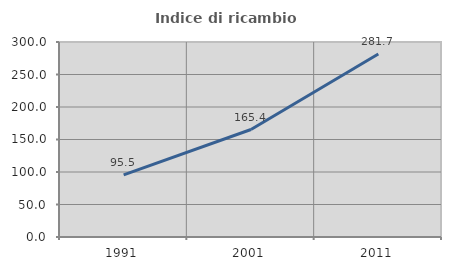
| Category | Indice di ricambio occupazionale  |
|---|---|
| 1991.0 | 95.541 |
| 2001.0 | 165.385 |
| 2011.0 | 281.667 |